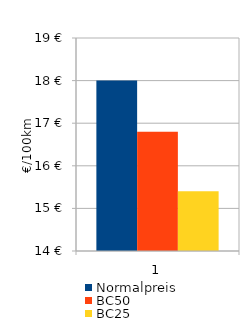
| Category | Normalpreis | BC50 | BC25 |
|---|---|---|---|
| 0 | 18 | 16.8 | 15.4 |